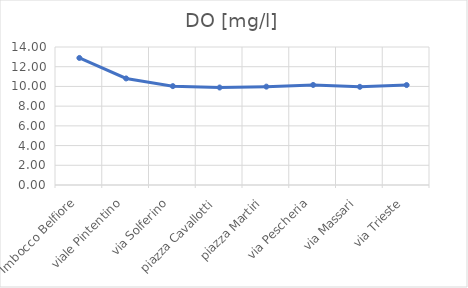
| Category | DO [mg/l] |
|---|---|
| Imbocco Belfiore | 12.89 |
| viale Pintentino | 10.81 |
| via Solferino | 10.03 |
| piazza Cavallotti | 9.89 |
| piazza Martiri | 9.98 |
| via Pescheria | 10.15 |
| via Massari | 9.96 |
| via Trieste | 10.14 |